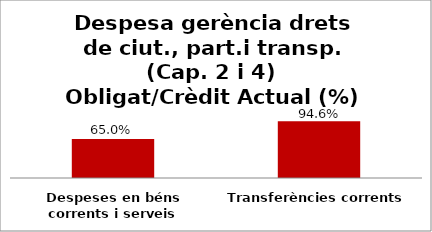
| Category | Series 0 |
|---|---|
| Despeses en béns corrents i serveis | 0.65 |
| Transferències corrents | 0.946 |